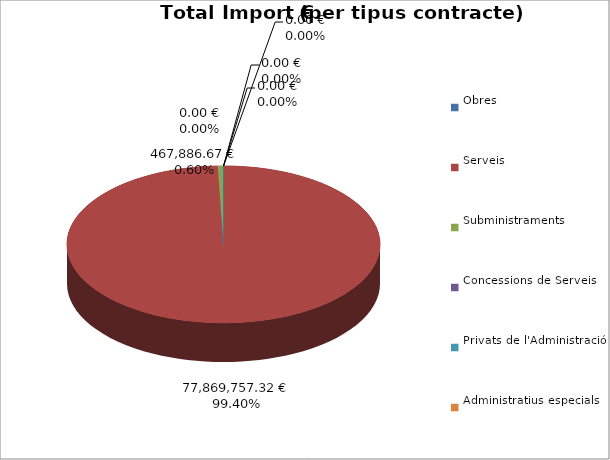
| Category | Total preu
(amb IVA) |
|---|---|
| Obres | 0 |
| Serveis | 77869757.32 |
| Subministraments | 467886.67 |
| Concessions de Serveis | 0 |
| Privats de l'Administració | 0 |
| Administratius especials | 0 |